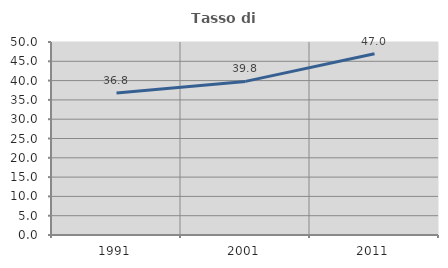
| Category | Tasso di occupazione   |
|---|---|
| 1991.0 | 36.803 |
| 2001.0 | 39.794 |
| 2011.0 | 46.957 |